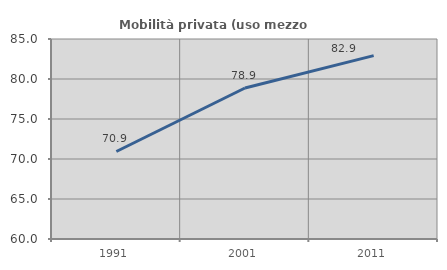
| Category | Mobilità privata (uso mezzo privato) |
|---|---|
| 1991.0 | 70.94 |
| 2001.0 | 78.877 |
| 2011.0 | 82.919 |